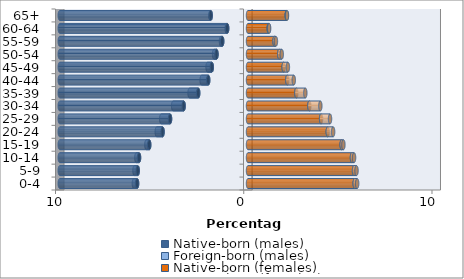
| Category | Native-born (males) | Foreign-born (males) | Native-born (females) | Foreign-born (females) |
|---|---|---|---|---|
| 0-4 | -5.891 | -0.173 | 5.668 | 0.131 |
| 5-9 | -5.857 | -0.175 | 5.632 | 0.133 |
| 10-14 | -5.788 | -0.144 | 5.522 | 0.113 |
| 15-19 | -5.247 | -0.152 | 4.975 | 0.094 |
| 20-24 | -4.538 | -0.308 | 4.237 | 0.286 |
| 25-29 | -4.14 | -0.469 | 3.883 | 0.475 |
| 30-34 | -3.418 | -0.559 | 3.259 | 0.584 |
| 35-39 | -2.645 | -0.46 | 2.568 | 0.478 |
| 40-44 | -2.113 | -0.349 | 2.087 | 0.345 |
| 45-49 | -1.922 | -0.226 | 1.895 | 0.225 |
| 50-54 | -1.673 | -0.128 | 1.657 | 0.136 |
| 55-59 | -1.369 | -0.066 | 1.408 | 0.076 |
| 60-64 | -1.106 | -0.025 | 1.1 | 0.022 |
| 65+ | -1.98 | -0.016 | 2.057 | 0.015 |